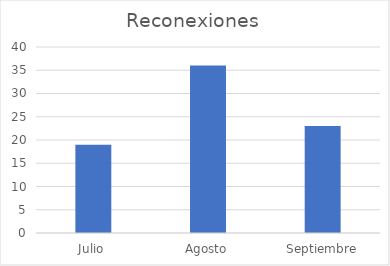
| Category | Reconexiones |
|---|---|
| Julio | 19 |
| Agosto | 36 |
| Septiembre | 23 |